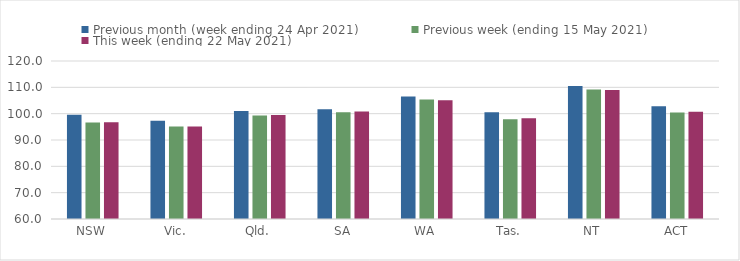
| Category | Previous month (week ending 24 Apr 2021) | Previous week (ending 15 May 2021) | This week (ending 22 May 2021) |
|---|---|---|---|
| NSW | 99.61 | 96.66 | 96.73 |
| Vic. | 97.35 | 95.1 | 95.14 |
| Qld. | 101.03 | 99.33 | 99.47 |
| SA | 101.67 | 100.5 | 100.8 |
| WA | 106.56 | 105.41 | 105.12 |
| Tas. | 100.51 | 97.86 | 98.22 |
| NT | 110.54 | 109.17 | 109 |
| ACT | 102.77 | 100.49 | 100.7 |